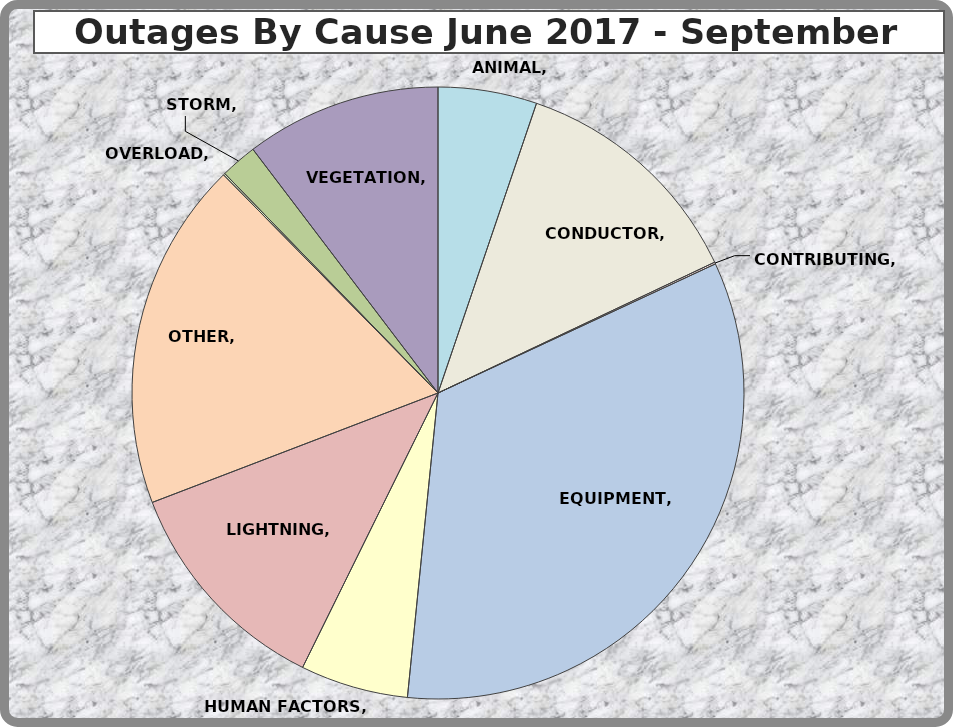
| Category | Series 0 |
|---|---|
| ANIMAL | 54 |
| CONDUCTOR | 132 |
| CONTRIBUTING | 1 |
| EQUIPMENT | 347 |
| HUMAN FACTORS | 59 |
| LIGHTNING | 123 |
| OTHER | 191 |
| OVERLOAD | 1 |
| STORM | 20 |
| VEGETATION | 107 |